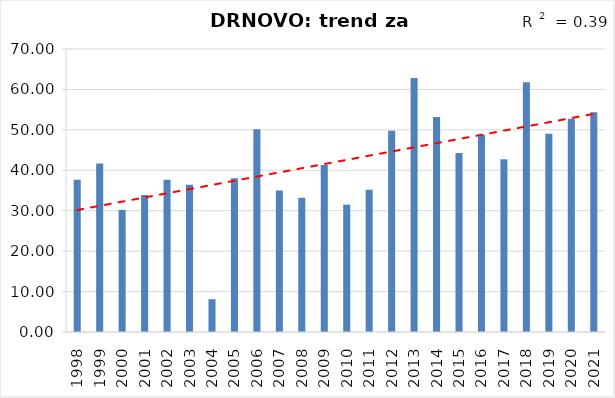
| Category | Vsota |
|---|---|
| 1998 | 37.65 |
| 1999 | 41.7 |
| 2000 | 30.2 |
| 2001 | 33.9 |
| 2002 | 37.65 |
| 2003 | 36.45 |
| 2004 | 8.12 |
| 2005 | 38 |
| 2006 | 50.15 |
| 2007 | 35.025 |
| 2008 | 33.2 |
| 2009 | 41.3 |
| 2010 | 31.5 |
| 2011 | 35.2 |
| 2012 | 49.75 |
| 2013 | 62.8 |
| 2014 | 53.2 |
| 2015 | 44.3 |
| 2016 | 48.8 |
| 2017 | 42.7 |
| 2018 | 61.75 |
| 2019 | 49.05 |
| 2020 | 52.75 |
| 2021 | 54.35 |